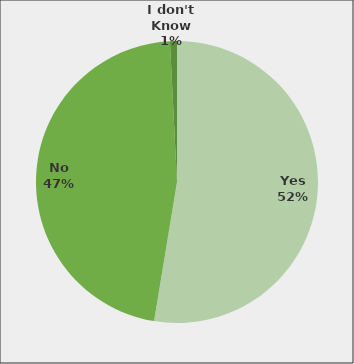
| Category | Series 0 |
|---|---|
| Yes | 0.526 |
| No | 0.466 |
| I don't Know | 0.008 |